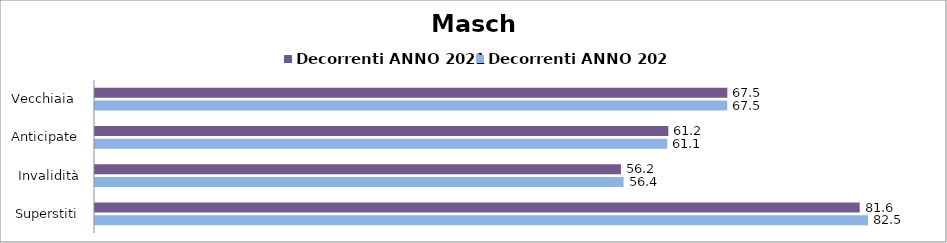
| Category | Decorrenti ANNO 2021 | Decorrenti ANNO 2022 |
|---|---|---|
| Vecchiaia  | 67.51 | 67.5 |
| Anticipate | 61.21 | 61.1 |
| Invalidità | 56.15 | 56.43 |
| Superstiti | 81.64 | 82.53 |